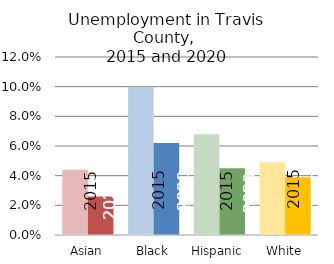
| Category | 2011-2015 | 2016-2020 |
|---|---|---|
| Asian | 0.044 | 0.026 |
| Black | 0.1 | 0.062 |
| Hispanic | 0.068 | 0.045 |
| White | 0.049 | 0.039 |